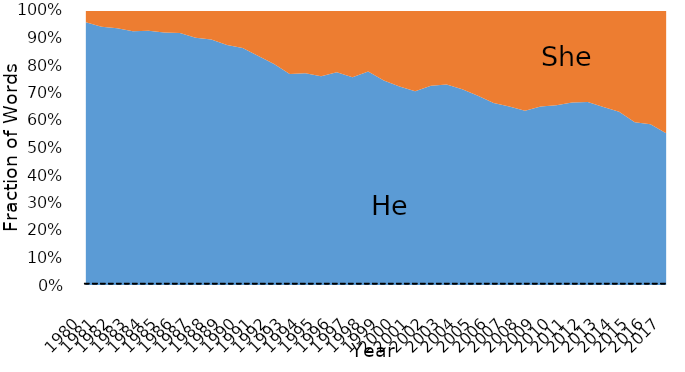
| Category | He | She |
|---|---|---|
| 0 | 0.738 | 0.034 |
| 1 | 0.792 | 0.052 |
| 2 | 0.834 | 0.059 |
| 3 | 0.857 | 0.072 |
| 4 | 0.809 | 0.066 |
| 5 | 0.775 | 0.069 |
| 6 | 0.735 | 0.067 |
| 7 | 0.746 | 0.084 |
| 8 | 0.678 | 0.081 |
| 9 | 0.663 | 0.097 |
| 10 | 0.651 | 0.105 |
| 11 | 0.679 | 0.136 |
| 12 | 0.668 | 0.163 |
| 13 | 0.613 | 0.186 |
| 14 | 0.612 | 0.182 |
| 15 | 0.618 | 0.196 |
| 16 | 0.648 | 0.189 |
| 17 | 0.632 | 0.205 |
| 18 | 0.635 | 0.183 |
| 19 | 0.61 | 0.21 |
| 20 | 0.606 | 0.234 |
| 21 | 0.605 | 0.253 |
| 22 | 0.617 | 0.234 |
| 23 | 0.612 | 0.227 |
| 24 | 0.594 | 0.24 |
| 25 | 0.58 | 0.263 |
| 26 | 0.552 | 0.282 |
| 27 | 0.546 | 0.295 |
| 28 | 0.538 | 0.31 |
| 29 | 0.546 | 0.296 |
| 30 | 0.527 | 0.279 |
| 31 | 0.518 | 0.262 |
| 32 | 0.538 | 0.27 |
| 33 | 0.532 | 0.29 |
| 34 | 0.522 | 0.306 |
| 35 | 0.487 | 0.336 |
| 36 | 0.483 | 0.344 |
| 37 | 0.451 | 0.367 |